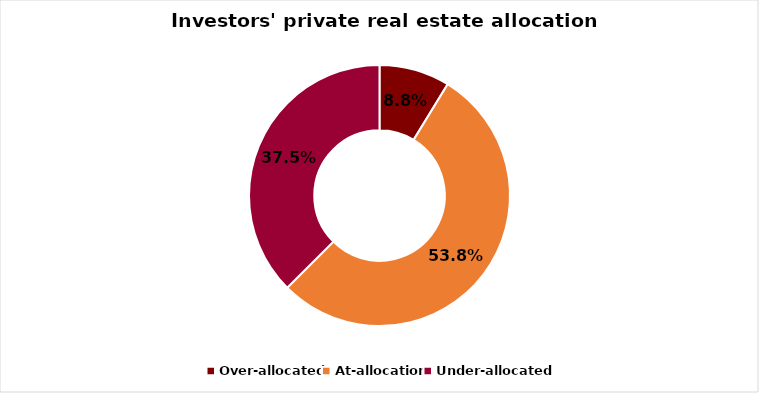
| Category | Series 0 |
|---|---|
| Over-allocated | 0.088 |
| At-allocation | 0.538 |
| Under-allocated | 0.375 |